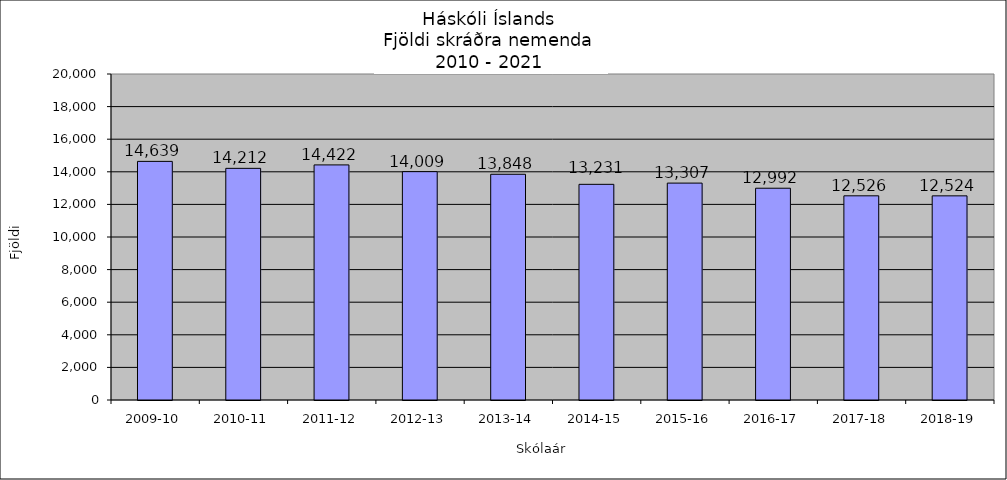
| Category | Series 0 |
|---|---|
| 2009-10 | 14639 |
| 2010-11 | 14212 |
| 2011-12 | 14422 |
| 2012-13 | 14009 |
| 2013-14 | 13848 |
| 2014-15 | 13231 |
| 2015-16 | 13307 |
| 2016-17 | 12992 |
| 2017-18 | 12526 |
| 2018-19 | 12524 |